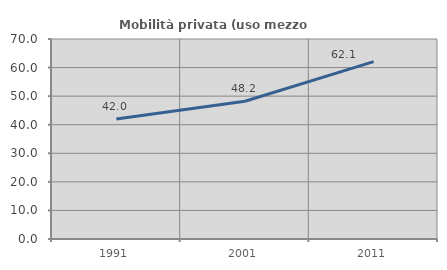
| Category | Mobilità privata (uso mezzo privato) |
|---|---|
| 1991.0 | 42.025 |
| 2001.0 | 48.22 |
| 2011.0 | 62.092 |